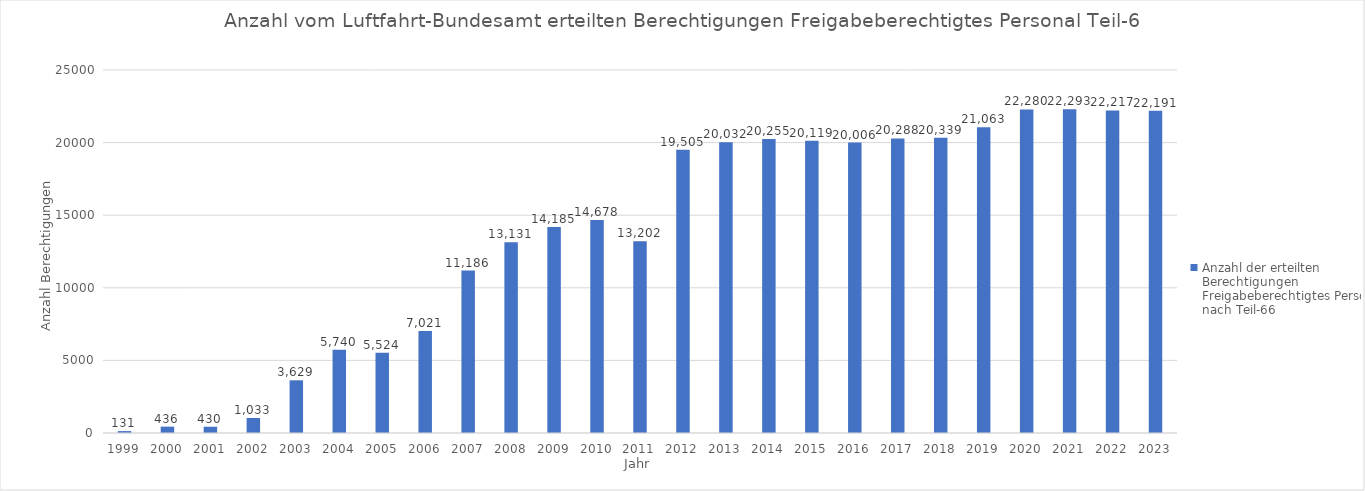
| Category | Anzahl der erteilten Berechtigungen Freigabeberechtigtes Personal nach Teil-66 |
|---|---|
| 1999.0 | 131 |
| 2000.0 | 436 |
| 2001.0 | 430 |
| 2002.0 | 1033 |
| 2003.0 | 3629 |
| 2004.0 | 5740 |
| 2005.0 | 5524 |
| 2006.0 | 7021 |
| 2007.0 | 11186 |
| 2008.0 | 13131 |
| 2009.0 | 14185 |
| 2010.0 | 14678 |
| 2011.0 | 13202 |
| 2012.0 | 19505 |
| 2013.0 | 20032 |
| 2014.0 | 20255 |
| 2015.0 | 20119 |
| 2016.0 | 20006 |
| 2017.0 | 20288 |
| 2018.0 | 20339 |
| 2019.0 | 21063 |
| 2020.0 | 22280 |
| 2021.0 | 22293 |
| 2022.0 | 22217 |
| 2023.0 | 22191 |